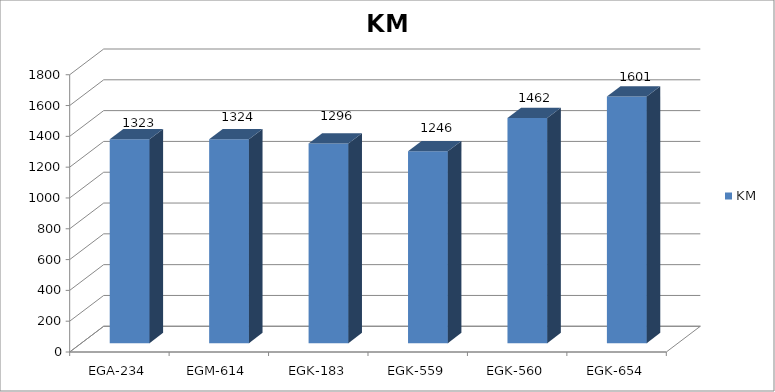
| Category | KM |
|---|---|
| EGA-234 | 1323 |
| EGM-614 | 1324 |
| EGK-183 | 1296 |
| EGK-559 | 1246 |
| EGK-560 | 1462 |
| EGK-654 | 1601 |